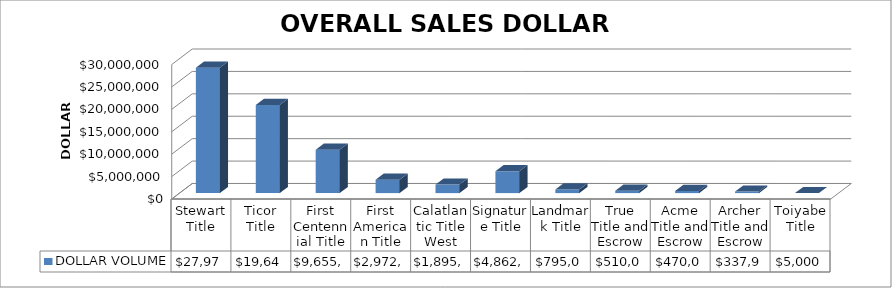
| Category | DOLLAR VOLUME |
|---|---|
| Stewart Title | 27976771 |
| Ticor Title | 19643111 |
| First Centennial Title | 9655455 |
| First American Title | 2972526.35 |
| Calatlantic Title West | 1895412 |
| Signature Title | 4862421 |
| Landmark Title | 795000 |
| True Title and Escrow | 510000 |
| Acme Title and Escrow | 470000 |
| Archer Title and Escrow | 337900 |
| Toiyabe Title | 5000 |